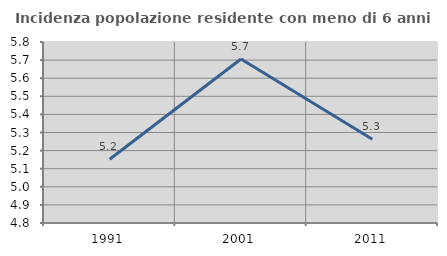
| Category | Incidenza popolazione residente con meno di 6 anni |
|---|---|
| 1991.0 | 5.152 |
| 2001.0 | 5.706 |
| 2011.0 | 5.263 |